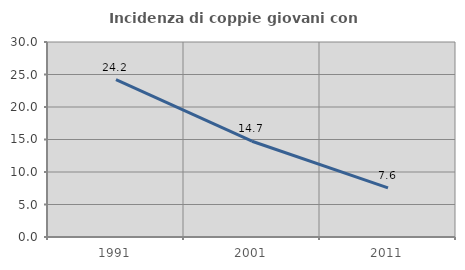
| Category | Incidenza di coppie giovani con figli |
|---|---|
| 1991.0 | 24.204 |
| 2001.0 | 14.737 |
| 2011.0 | 7.557 |